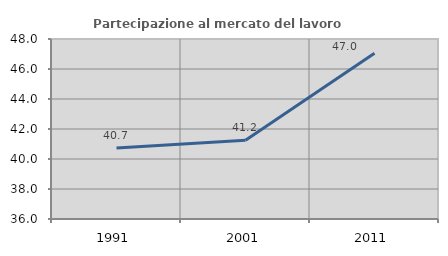
| Category | Partecipazione al mercato del lavoro  femminile |
|---|---|
| 1991.0 | 40.735 |
| 2001.0 | 41.243 |
| 2011.0 | 47.047 |